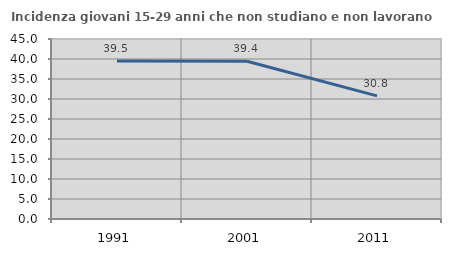
| Category | Incidenza giovani 15-29 anni che non studiano e non lavorano  |
|---|---|
| 1991.0 | 39.514 |
| 2001.0 | 39.446 |
| 2011.0 | 30.769 |